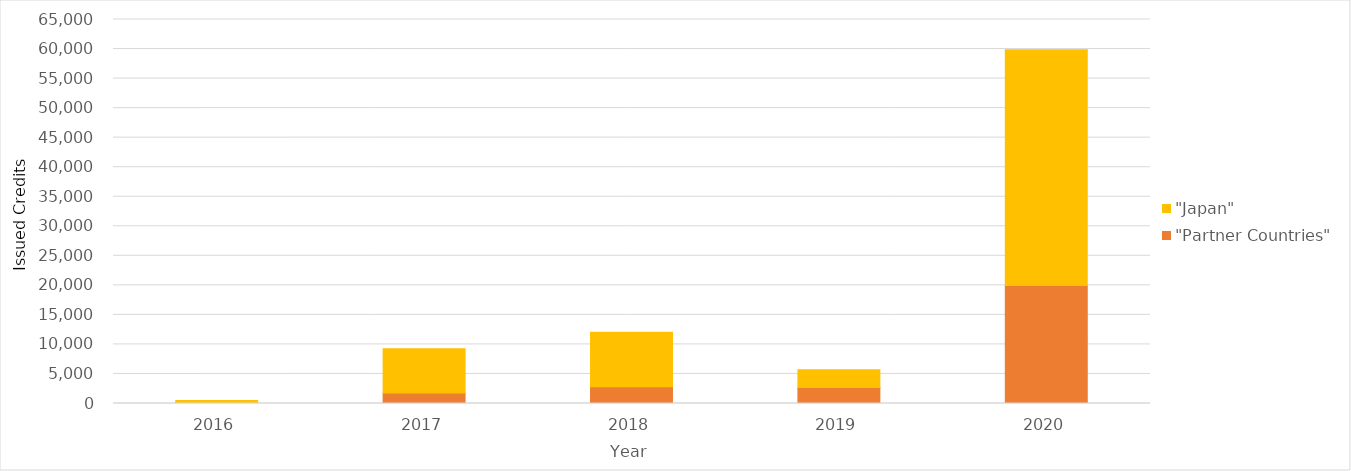
| Category | "Partner Countries" | "Japan" |
|---|---|---|
| 2016.0 | 115 | 378 |
| 2017.0 | 1789 | 7464 |
| 2018.0 | 2831 | 9237 |
| 2019.0 | 2688 | 3031 |
| 2020.0 | 19962 | 39926 |